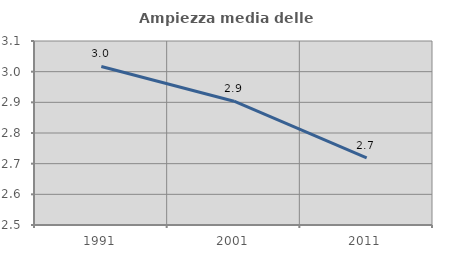
| Category | Ampiezza media delle famiglie |
|---|---|
| 1991.0 | 3.017 |
| 2001.0 | 2.904 |
| 2011.0 | 2.719 |